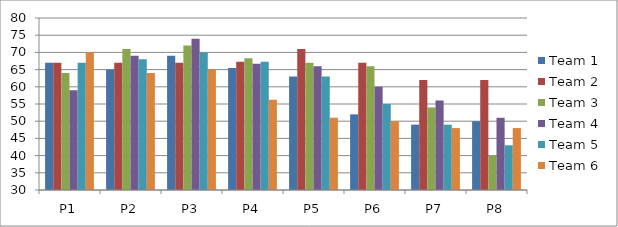
| Category | Team 1 | Team 2 | Team 3 | Team 4 | Team 5 | Team 6 |
|---|---|---|---|---|---|---|
| P1 | 67 | 67 | 64 | 59 | 67 | 70 |
| P2 | 65 | 67 | 71 | 69 | 68 | 64 |
| P3 | 69 | 67 | 72 | 74 | 70 | 65 |
| P4 | 65.5 | 67.3 | 68.3 | 66.7 | 67.3 | 56.2 |
| P5 | 63 | 71 | 67 | 66 | 63 | 51 |
| P6 | 52 | 67 | 66 | 60 | 55 | 50 |
| P7 | 49 | 62 | 54 | 56 | 49 | 48 |
| P8 | 50 | 62 | 40 | 51 | 43 | 48 |